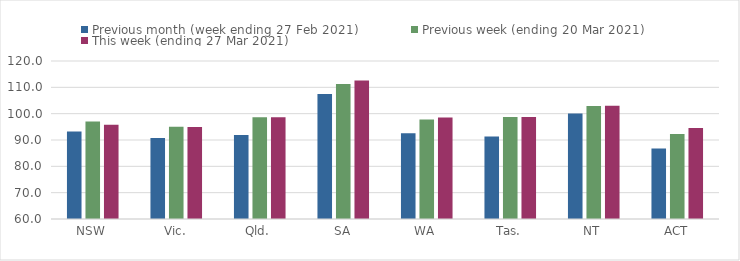
| Category | Previous month (week ending 27 Feb 2021) | Previous week (ending 20 Mar 2021) | This week (ending 27 Mar 2021) |
|---|---|---|---|
| NSW | 93.19 | 97.01 | 95.8 |
| Vic. | 90.73 | 95.04 | 94.92 |
| Qld. | 91.87 | 98.64 | 98.64 |
| SA | 107.5 | 111.29 | 112.58 |
| WA | 92.58 | 97.76 | 98.55 |
| Tas. | 91.35 | 98.77 | 98.77 |
| NT | 100.11 | 102.93 | 103.05 |
| ACT | 86.75 | 92.3 | 94.52 |